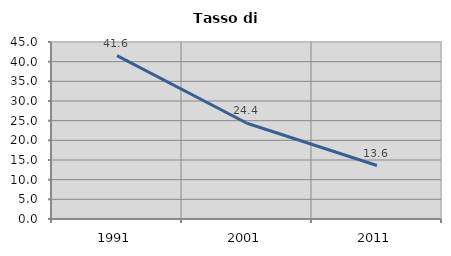
| Category | Tasso di disoccupazione   |
|---|---|
| 1991.0 | 41.555 |
| 2001.0 | 24.352 |
| 2011.0 | 13.595 |